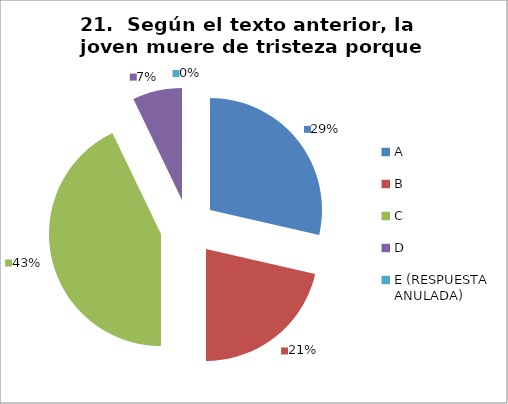
| Category | CANTIDAD DE RESPUESTAS PREGUNTA (21) | PORCENTAJE |
|---|---|---|
| A | 8 | 0.286 |
| B | 6 | 0.214 |
| C | 12 | 0.429 |
| D | 2 | 0.071 |
| E (RESPUESTA ANULADA) | 0 | 0 |